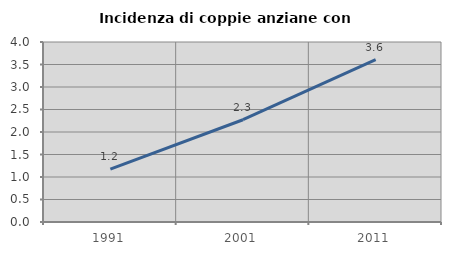
| Category | Incidenza di coppie anziane con figli |
|---|---|
| 1991.0 | 1.174 |
| 2001.0 | 2.273 |
| 2011.0 | 3.611 |